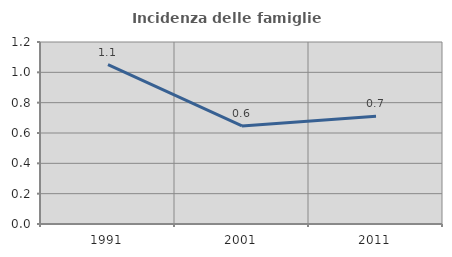
| Category | Incidenza delle famiglie numerose |
|---|---|
| 1991.0 | 1.051 |
| 2001.0 | 0.646 |
| 2011.0 | 0.71 |